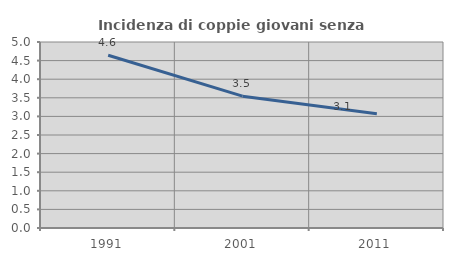
| Category | Incidenza di coppie giovani senza figli |
|---|---|
| 1991.0 | 4.644 |
| 2001.0 | 3.544 |
| 2011.0 | 3.069 |